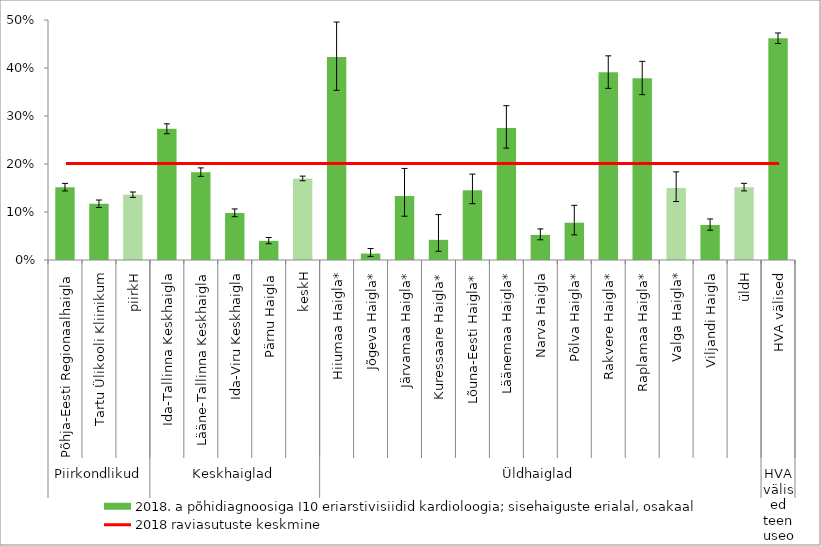
| Category | 2018. a põhidiagnoosiga I10 eriarstivisiidid kardioloogia; sisehaiguste erialal, osakaal |
|---|---|
| 0 | 0.152 |
| 1 | 0.117 |
| 2 | 0.136 |
| 3 | 0.273 |
| 4 | 0.183 |
| 5 | 0.098 |
| 6 | 0.04 |
| 7 | 0.17 |
| 8 | 0.423 |
| 9 | 0.013 |
| 10 | 0.133 |
| 11 | 0.042 |
| 12 | 0.145 |
| 13 | 0.275 |
| 14 | 0.052 |
| 15 | 0.078 |
| 16 | 0.391 |
| 17 | 0.379 |
| 18 | 0.15 |
| 19 | 0.073 |
| 20 | 0.152 |
| 21 | 0.462 |